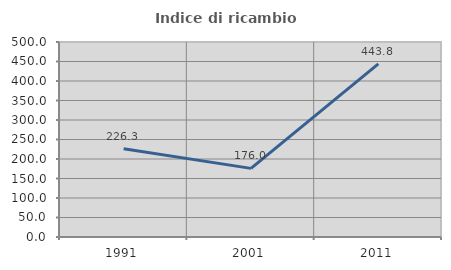
| Category | Indice di ricambio occupazionale  |
|---|---|
| 1991.0 | 226.316 |
| 2001.0 | 176 |
| 2011.0 | 443.75 |